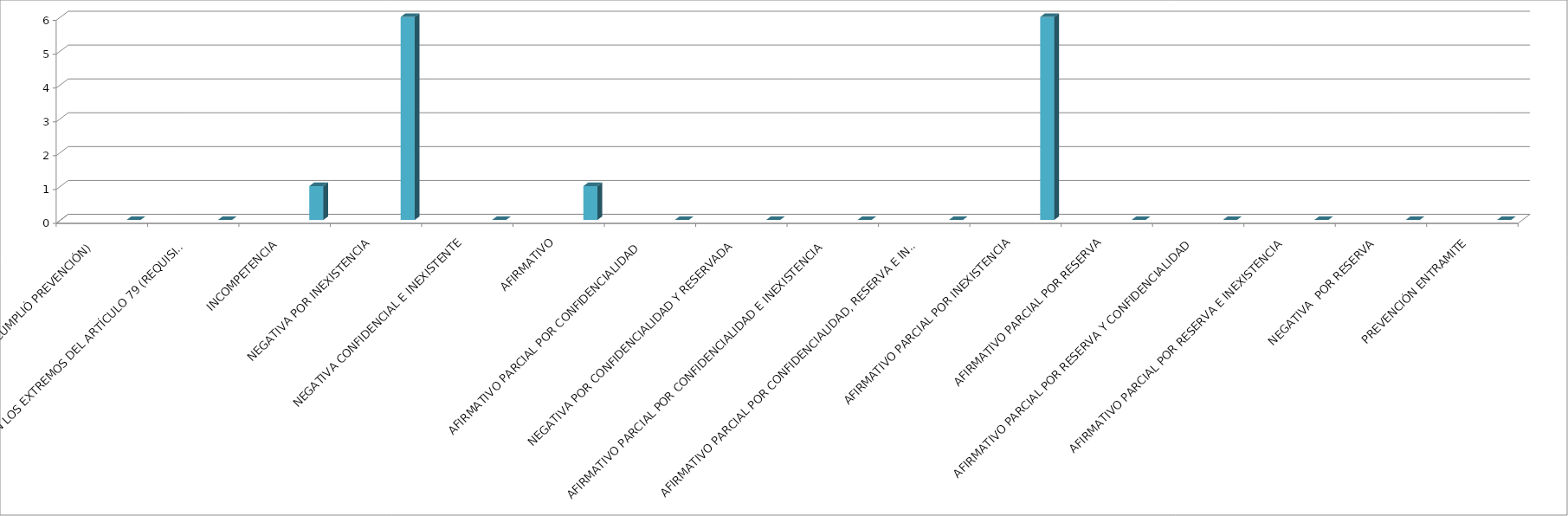
| Category | Series 0 | Series 1 | Series 2 | Series 3 | Series 4 |
|---|---|---|---|---|---|
| SE TIENE POR NO PRESENTADA ( NO CUMPLIÓ PREVENCIÓN) |  |  |  |  | 0 |
| NO CUMPLIO CON LOS EXTREMOS DEL ARTÍCULO 79 (REQUISITOS) |  |  |  |  | 0 |
| INCOMPETENCIA  |  |  |  |  | 1 |
| NEGATIVA POR INEXISTENCIA |  |  |  |  | 6 |
| NEGATIVA CONFIDENCIAL E INEXISTENTE |  |  |  |  | 0 |
| AFIRMATIVO |  |  |  |  | 1 |
| AFIRMATIVO PARCIAL POR CONFIDENCIALIDAD  |  |  |  |  | 0 |
| NEGATIVA POR CONFIDENCIALIDAD Y RESERVADA |  |  |  |  | 0 |
| AFIRMATIVO PARCIAL POR CONFIDENCIALIDAD E INEXISTENCIA |  |  |  |  | 0 |
| AFIRMATIVO PARCIAL POR CONFIDENCIALIDAD, RESERVA E INEXISTENCIA |  |  |  |  | 0 |
| AFIRMATIVO PARCIAL POR INEXISTENCIA |  |  |  |  | 6 |
| AFIRMATIVO PARCIAL POR RESERVA |  |  |  |  | 0 |
| AFIRMATIVO PARCIAL POR RESERVA Y CONFIDENCIALIDAD |  |  |  |  | 0 |
| AFIRMATIVO PARCIAL POR RESERVA E INEXISTENCIA |  |  |  |  | 0 |
| NEGATIVA  POR RESERVA |  |  |  |  | 0 |
| PREVENCIÓN ENTRAMITE |  |  |  |  | 0 |